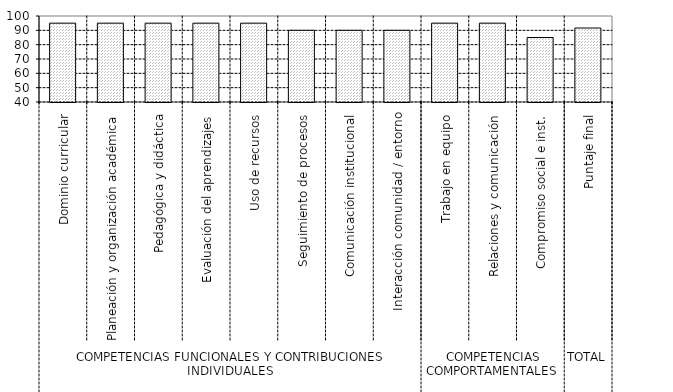
| Category | Series 0 |
|---|---|
| 0 | 95 |
| 1 | 95 |
| 2 | 95 |
| 3 | 95 |
| 4 | 95 |
| 5 | 90 |
| 6 | 90 |
| 7 | 90 |
| 8 | 95 |
| 9 | 95 |
| 10 | 85 |
| 11 | 91.625 |